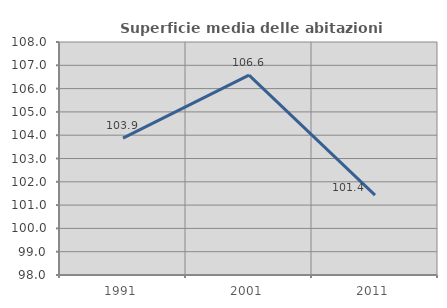
| Category | Superficie media delle abitazioni occupate |
|---|---|
| 1991.0 | 103.875 |
| 2001.0 | 106.576 |
| 2011.0 | 101.426 |